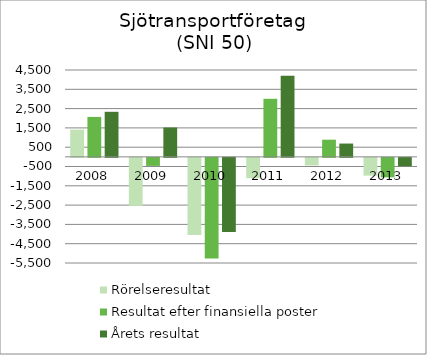
| Category | Rörelseresultat | Resultat efter finansiella poster | Årets resultat |
|---|---|---|---|
| 2008.0 | 1410.097 | 2068.635 | 2334 |
| 2009.0 | -2490.518 | -416.431 | 1520 |
| 2010.0 | -3993.031 | -5217.816 | -3845.881 |
| 2011.0 | -1054.89 | 3008 | 4206 |
| 2012.0 | -396.67 | 888.86 | 689.281 |
| 2013.0 | -920.448 | -1008.326 | -432.231 |